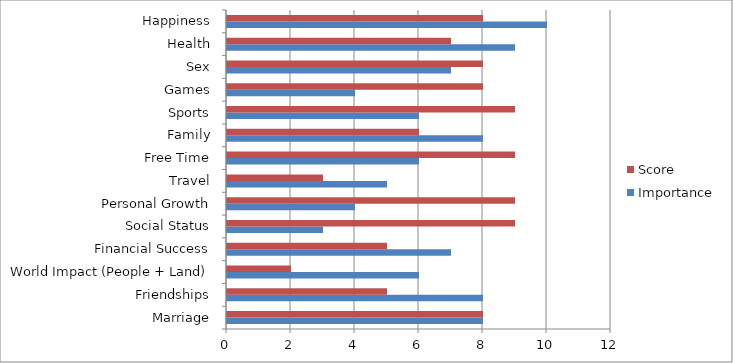
| Category | Importance | Score |
|---|---|---|
| Marriage | 8 | 8 |
| Friendships | 8 | 5 |
| World Impact (People + Land) | 6 | 2 |
| Financial Success | 7 | 5 |
| Social Status | 3 | 9 |
| Personal Growth | 4 | 9 |
| Travel | 5 | 3 |
| Free Time | 6 | 9 |
| Family | 8 | 6 |
| Sports | 6 | 9 |
| Games | 4 | 8 |
| Sex | 7 | 8 |
| Health | 9 | 7 |
| Happiness | 10 | 8 |